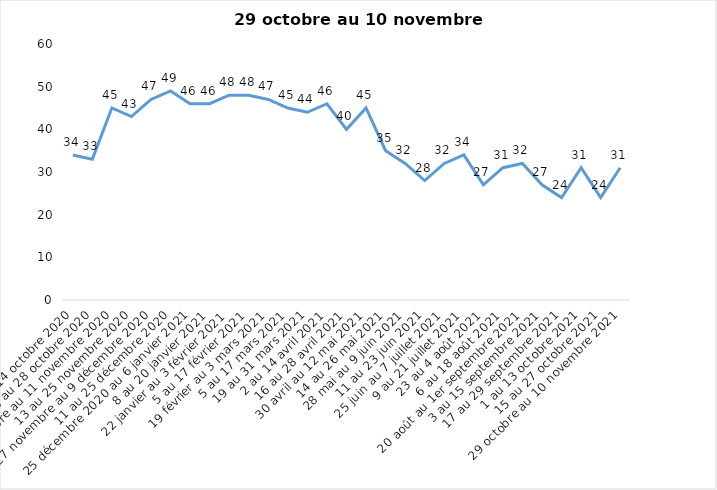
| Category | Toujours aux trois mesures |
|---|---|
| 2 au 14 octobre 2020 | 34 |
| 16 au 28 octobre 2020 | 33 |
| 30 octobre au 11 novembre 2020 | 45 |
| 13 au 25 novembre 2020 | 43 |
| 27 novembre au 9 décembre 2020 | 47 |
| 11 au 25 décembre 2020 | 49 |
| 25 décembre 2020 au 6 janvier 2021 | 46 |
| 8 au 20 janvier 2021 | 46 |
| 22 janvier au 3 février 2021 | 48 |
| 5 au 17 février 2021 | 48 |
| 19 février au 3 mars 2021 | 47 |
| 5 au 17 mars 2021 | 45 |
| 19 au 31 mars 2021 | 44 |
| 2 au 14 avril 2021 | 46 |
| 16 au 28 avril 2021 | 40 |
| 30 avril au 12 mai 2021 | 45 |
| 14 au 26 mai 2021 | 35 |
| 28 mai au 9 juin 2021 | 32 |
| 11 au 23 juin 2021 | 28 |
| 25 juin au 7 juillet 2021 | 32 |
| 9 au 21 juillet 2021 | 34 |
| 23 au 4 août 2021 | 27 |
| 6 au 18 août 2021 | 31 |
| 20 août au 1er septembre 2021 | 32 |
| 3 au 15 septembre 2021 | 27 |
| 17 au 29 septembre 2021 | 24 |
| 1 au 13 octobre 2021 | 31 |
| 15 au 27 octobre 2021 | 24 |
| 29 octobre au 10 novembre 2021 | 31 |